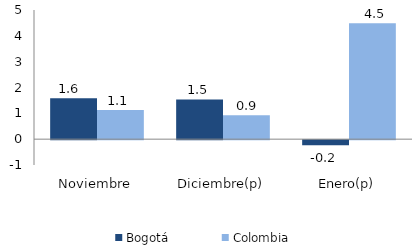
| Category | Bogotá | Colombia |
|---|---|---|
| Noviembre | 1.581 | 1.131 |
| Diciembre(p) | 1.539 | 0.922 |
| Enero(p) | -0.193 | 4.483 |